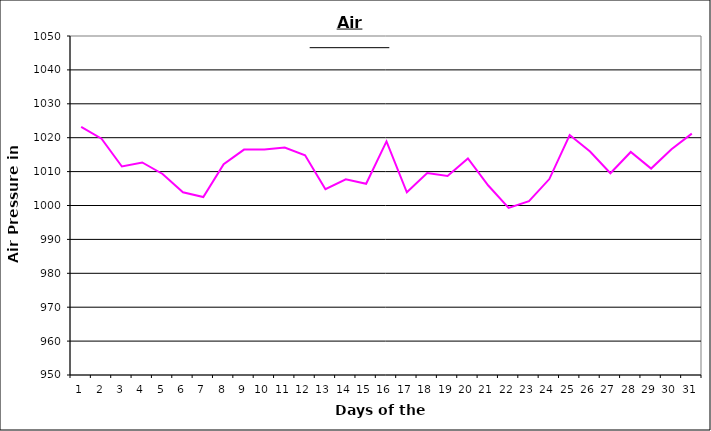
| Category | Series 0 |
|---|---|
| 0 | 1023.2 |
| 1 | 1019.7 |
| 2 | 1011.5 |
| 3 | 1012.7 |
| 4 | 1009.3 |
| 5 | 1003.9 |
| 6 | 1002.5 |
| 7 | 1012.2 |
| 8 | 1016.5 |
| 9 | 1016.5 |
| 10 | 1017.1 |
| 11 | 1014.8 |
| 12 | 1004.8 |
| 13 | 1007.7 |
| 14 | 1006.4 |
| 15 | 1018.9 |
| 16 | 1003.9 |
| 17 | 1009.6 |
| 18 | 1008.7 |
| 19 | 1013.9 |
| 20 | 1005.9 |
| 21 | 999.3 |
| 22 | 1001.3 |
| 23 | 1007.8 |
| 24 | 1020.8 |
| 25 | 1015.9 |
| 26 | 1009.5 |
| 27 | 1015.8 |
| 28 | 1010.9 |
| 29 | 1016.6 |
| 30 | 1021.2 |